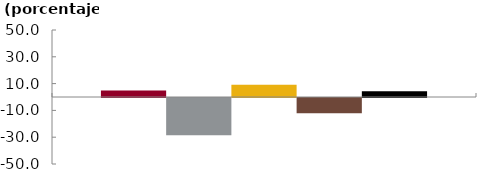
| Category | Bancos | CF | CFC | Coop | Sistema |
|---|---|---|---|---|---|
|  | 4.814 | -27.72 | 9.197 | -11.351 | 4.377 |